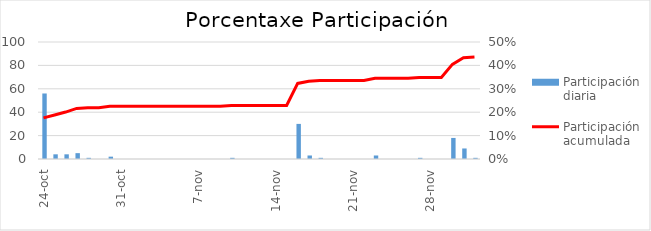
| Category | Participación diaria |
|---|---|
| 2016-10-24 | 56 |
| 2016-10-25 | 4 |
| 2016-10-26 | 4 |
| 2016-10-27 | 5 |
| 2016-10-28 | 1 |
| 2016-10-29 | 0 |
| 2016-10-30 | 2 |
| 2016-10-31 | 0 |
| 2016-11-01 | 0 |
| 2016-11-02 | 0 |
| 2016-11-03 | 0 |
| 2016-11-04 | 0 |
| 2016-11-05 | 0 |
| 2016-11-06 | 0 |
| 2016-11-07 | 0 |
| 2016-11-08 | 0 |
| 2016-11-09 | 0 |
| 2016-11-10 | 1 |
| 2016-11-11 | 0 |
| 2016-11-12 | 0 |
| 2016-11-13 | 0 |
| 2016-11-14 | 0 |
| 2016-11-15 | 0 |
| 2016-11-16 | 30 |
| 2016-11-17 | 3 |
| 2016-11-18 | 1 |
| 2016-11-19 | 0 |
| 2016-11-20 | 0 |
| 2016-11-21 | 0 |
| 2016-11-22 | 0 |
| 2016-11-23 | 3 |
| 2016-11-24 | 0 |
| 2016-11-25 | 0 |
| 2016-11-26 | 0 |
| 2016-11-27 | 1 |
| 2016-11-28 | 0 |
| 2016-11-29 | 0 |
| 2016-11-30 | 18 |
| 2016-12-01 | 9 |
| 2016-12-02 | 1 |